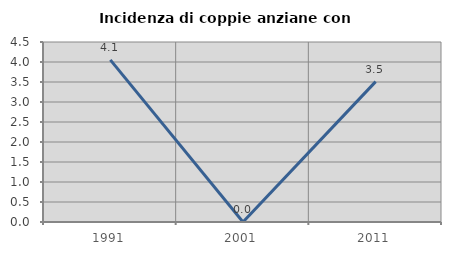
| Category | Incidenza di coppie anziane con figli |
|---|---|
| 1991.0 | 4.054 |
| 2001.0 | 0 |
| 2011.0 | 3.509 |